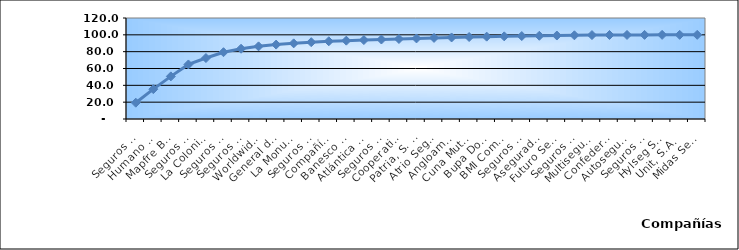
| Category | Series 0 |
|---|---|
| Seguros Universal, S. A. | 19.355 |
| Humano Seguros, S. A. | 35.468 |
| Mapfre BHD Compañía de Seguros | 50.64 |
| Seguros Reservas, S. A. | 64.801 |
| La Colonial, S. A., Compañia De Seguros | 72.437 |
| Seguros Sura, S.A. | 79.357 |
| Seguros Crecer, S. A. | 83.501 |
| Worldwide Seguros, S. A. | 86.318 |
| General de Seguros, S. A. | 88.402 |
| La Monumental de Seguros, S. A. | 89.888 |
| Seguros Pepín, S. A. | 91.257 |
| Compañía Dominicana de Seguros, C. por A. | 92.356 |
| Banesco Seguros | 93.078 |
| Atlántica Seguros, S. A. | 93.776 |
| Seguros La Internacional, S. A. | 94.442 |
| Cooperativa Nacional De Seguros, Inc  | 95.077 |
| Patria, S. A., Compañía de Seguros | 95.728 |
| Atrio Seguros S. A. | 96.334 |
| Angloamericana de Seguros, S. A. | 96.883 |
| Cuna Mutual Insurance Society Dominicana | 97.423 |
| Bupa Dominicana, S. A. | 97.842 |
| BMI Compañía de Seguros, S. A. | 98.216 |
| Seguros APS, S.R.L. | 98.558 |
| Aseguradora Agropecuaria Dominicana, S. A. | 98.874 |
| Futuro Seguros | 99.173 |
| Seguros Ademi, S.A. | 99.445 |
| Multiseguros Su, S.A. | 99.713 |
| Confederación del Canadá Dominicana, S. A. | 99.819 |
| Autoseguro, S. A. | 99.871 |
| Seguros Yunen, S.A. | 99.92 |
| Hylseg Seguros S.A | 99.966 |
| Unit, S.A. | 99.99 |
| Midas Seguros, S.A. | 100 |